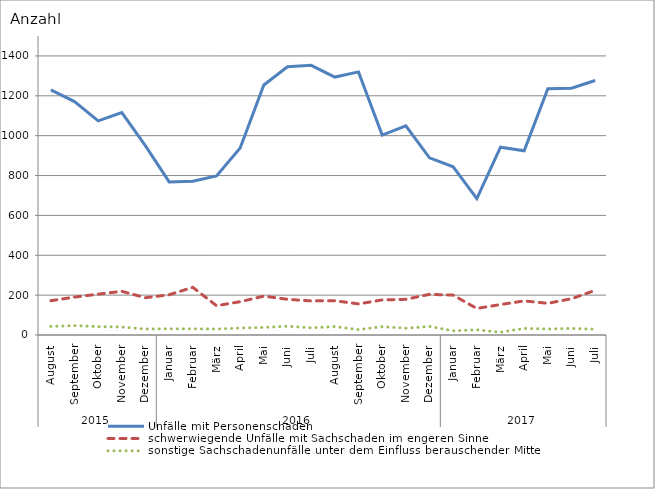
| Category | Unfälle mit Personenschaden | schwerwiegende Unfälle mit Sachschaden im engeren Sinne | sonstige Sachschadenunfälle unter dem Einfluss berauschender Mittel |
|---|---|---|---|
| 0 | 1230 | 172 | 43 |
| 1 | 1171 | 190 | 47 |
| 2 | 1074 | 205 | 42 |
| 3 | 1116 | 219 | 40 |
| 4 | 949 | 187 | 30 |
| 5 | 768 | 202 | 31 |
| 6 | 771 | 239 | 31 |
| 7 | 798 | 147 | 30 |
| 8 | 938 | 167 | 35 |
| 9 | 1254 | 195 | 38 |
| 10 | 1346 | 179 | 44 |
| 11 | 1353 | 171 | 36 |
| 12 | 1294 | 172 | 42 |
| 13 | 1320 | 156 | 27 |
| 14 | 1003 | 176 | 42 |
| 15 | 1049 | 179 | 34 |
| 16 | 889 | 204 | 43 |
| 17 | 844 | 200 | 21 |
| 18 | 684 | 133 | 26 |
| 19 | 942 | 153 | 14 |
| 20 | 924 | 171 | 33 |
| 21 | 1235 | 159 | 30 |
| 22 | 1238 | 182 | 33 |
| 23 | 1277 | 224 | 29 |